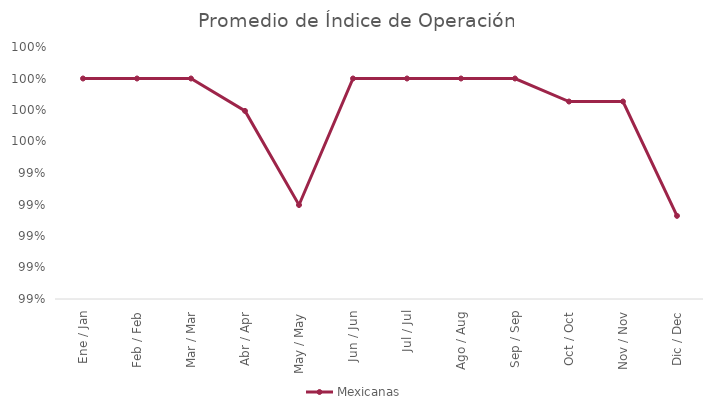
| Category | Mexicanas |
|---|---|
| Ene / Jan | 1 |
| Feb / Feb | 1 |
| Mar / Mar | 1 |
| Abr / Apr | 0.998 |
| May / May | 0.992 |
| Jun / Jun | 1 |
| Jul / Jul | 1 |
| Ago / Aug | 1 |
| Sep / Sep | 1 |
| Oct / Oct | 0.999 |
| Nov / Nov | 0.999 |
| Dic / Dec | 0.991 |